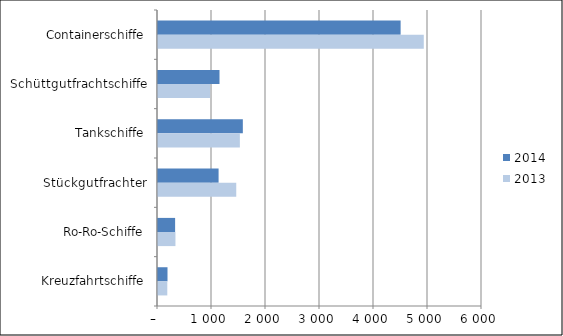
| Category | 2014 | 2013 |
|---|---|---|
| Containerschiffe | 4493 | 4922 |
| Schüttgutfrachtschiffe | 1139 | 966 |
| Tankschiffe | 1571 | 1516 |
| Stückgutfrachter | 1122 | 1449 |
| Ro-Ro-Schiffe | 317 | 323 |
| Kreuzfahrtschiffe | 176 | 172 |